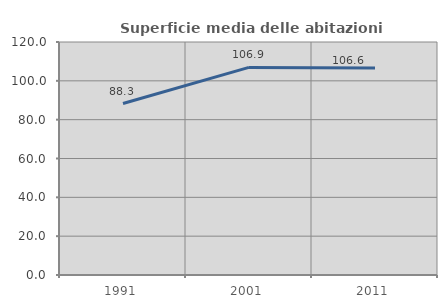
| Category | Superficie media delle abitazioni occupate |
|---|---|
| 1991.0 | 88.315 |
| 2001.0 | 106.928 |
| 2011.0 | 106.557 |